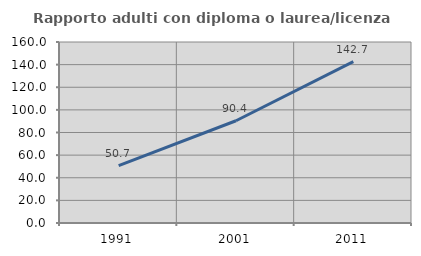
| Category | Rapporto adulti con diploma o laurea/licenza media  |
|---|---|
| 1991.0 | 50.654 |
| 2001.0 | 90.404 |
| 2011.0 | 142.67 |